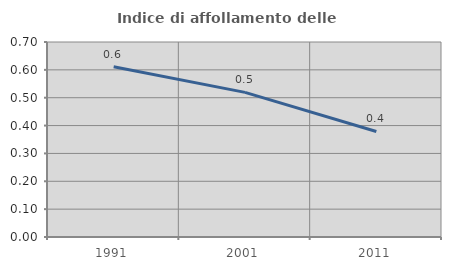
| Category | Indice di affollamento delle abitazioni  |
|---|---|
| 1991.0 | 0.611 |
| 2001.0 | 0.519 |
| 2011.0 | 0.379 |